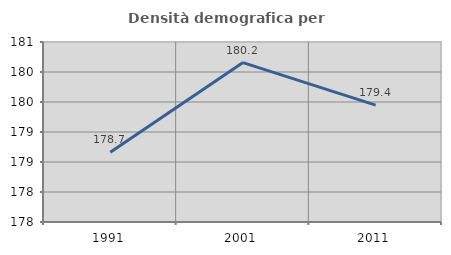
| Category | Densità demografica |
|---|---|
| 1991.0 | 178.662 |
| 2001.0 | 180.157 |
| 2011.0 | 179.449 |